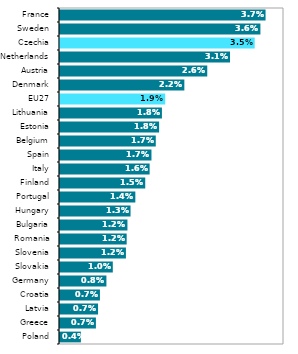
| Category | Series 1 |
|---|---|
| Poland | 0.004 |
| Greece | 0.007 |
| Latvia | 0.007 |
| Croatia | 0.007 |
| Germany | 0.008 |
| Slovakia | 0.01 |
| Slovenia | 0.012 |
| Romania | 0.012 |
| Bulgaria | 0.012 |
| Hungary | 0.013 |
| Portugal | 0.014 |
| Finland | 0.015 |
| Italy | 0.016 |
| Spain | 0.017 |
| Belgium | 0.017 |
| Estonia | 0.018 |
| Lithuania | 0.018 |
| EU27 | 0.019 |
| Denmark | 0.022 |
| Austria | 0.026 |
| Netherlands | 0.031 |
| Czechia | 0.035 |
| Sweden | 0.036 |
| France | 0.037 |